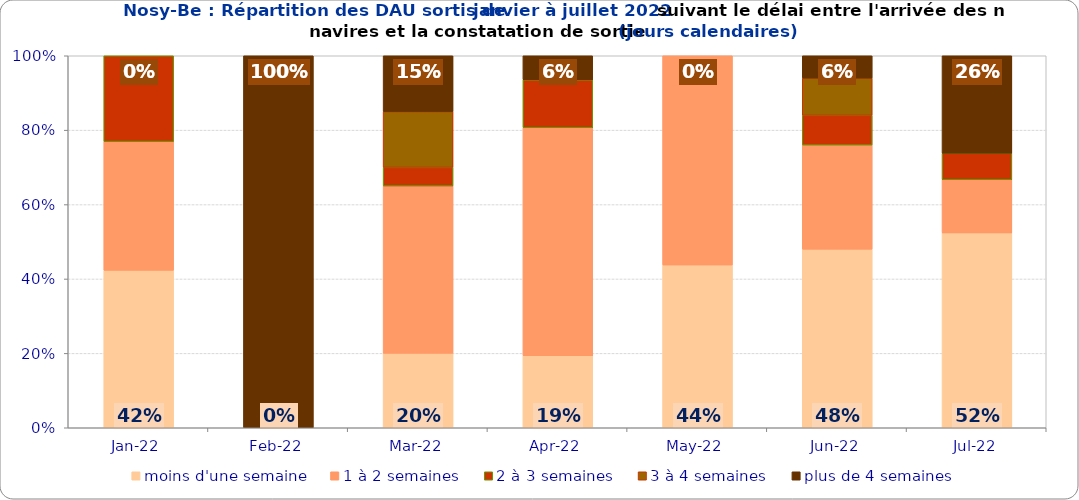
| Category | moins d'une semaine | 1 à 2 semaines | 2 à 3 semaines | 3 à 4 semaines | plus de 4 semaines |
|---|---|---|---|---|---|
| 2022-01-01 | 0.423 | 0.346 | 0.231 | 0 | 0 |
| 2022-02-01 | 0 | 0 | 0 | 0 | 1 |
| 2022-03-01 | 0.2 | 0.45 | 0.05 | 0.15 | 0.15 |
| 2022-04-01 | 0.194 | 0.613 | 0.129 | 0 | 0.065 |
| 2022-05-01 | 0.438 | 0.562 | 0 | 0 | 0 |
| 2022-06-01 | 0.48 | 0.28 | 0.08 | 0.1 | 0.06 |
| 2022-07-01 | 0.524 | 0.143 | 0.071 | 0 | 0.262 |